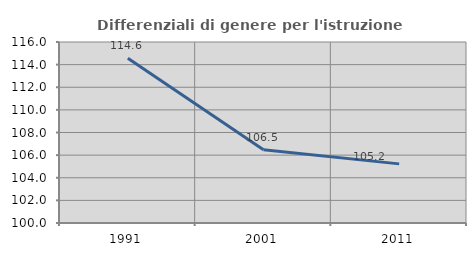
| Category | Differenziali di genere per l'istruzione superiore |
|---|---|
| 1991.0 | 114.554 |
| 2001.0 | 106.473 |
| 2011.0 | 105.227 |